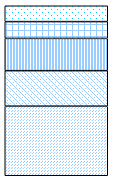
| Category | 65-70 | 70-75 | 75-80 | 80-85 | 85 und mehr |
|---|---|---|---|---|---|
| 0 | 2222 | 1133 | 1031 | 536 | 506 |